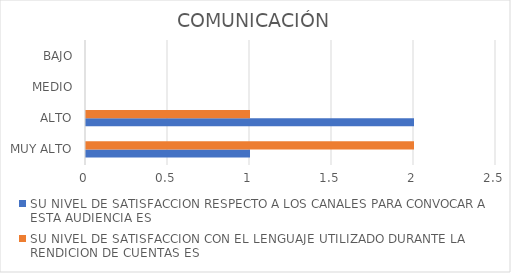
| Category | SU NIVEL DE SATISFACCION RESPECTO A LOS CANALES PARA CONVOCAR A ESTA AUDIENCIA ES | SU NIVEL DE SATISFACCION CON EL LENGUAJE UTILIZADO DURANTE LA RENDICION DE CUENTAS ES |
|---|---|---|
| MUY ALTO | 1 | 2 |
| ALTO | 2 | 1 |
| MEDIO | 0 | 0 |
| BAJO | 0 | 0 |